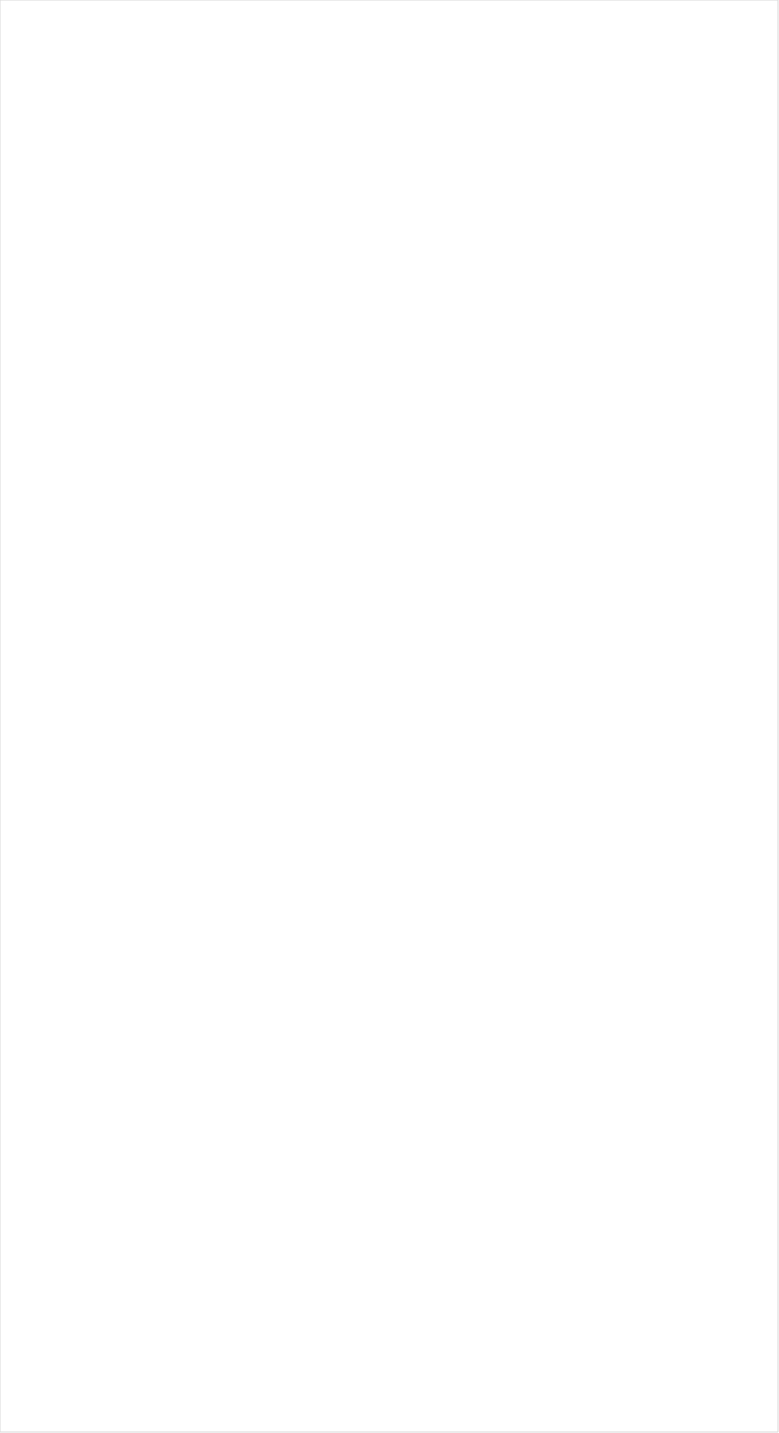
| Category | Total |
|---|---|
| Galavision | -0.905 |
| UniMas | -0.888 |
| Univision | -0.87 |
| NBC Universo | -0.861 |
| Telemundo | -0.85 |
| ESPN Deportes | -0.818 |
| TUDN | -0.803 |
| MTV2 | -0.724 |
| BET | -0.683 |
| Cartoon Network | -0.678 |
| TV ONE | -0.644 |
| Nick Toons | -0.643 |
| VH1 | -0.633 |
| Nick | -0.576 |
| Lifetime Movies | -0.522 |
| Disney Channel | -0.506 |
| Adult Swim | -0.503 |
| BET Her | -0.483 |
| Disney XD | -0.462 |
| Nick Jr. | -0.432 |
| Discovery Life Channel | -0.41 |
| Universal Kids | -0.367 |
| WE TV | -0.367 |
| Investigation Discovery | -0.366 |
| Logo | -0.365 |
| Disney Junior US | -0.359 |
| Oprah Winfrey Network | -0.348 |
| Travel | -0.333 |
| Lifetime | -0.324 |
| TLC | -0.32 |
| Nick@Nite | -0.318 |
| FXDEP | -0.298 |
| MTV | -0.251 |
| UP TV | -0.242 |
| OXYGEN | -0.217 |
| Discovery Family Channel | -0.207 |
| Freeform | -0.204 |
| E! | -0.179 |
| FXX | -0.163 |
| Hallmark Movies & Mysteries | -0.154 |
| truTV | -0.141 |
| Headline News | -0.139 |
| Hallmark | -0.123 |
| USA Network | -0.122 |
| A&E | -0.121 |
| INSP | -0.12 |
| ION | -0.118 |
| CMTV | -0.107 |
| FX | -0.106 |
| CW | -0.079 |
| Paramount Network | -0.075 |
| SYFY | -0.072 |
| BRAVO | -0.058 |
| Reelz Channel | -0.022 |
| POP | -0.016 |
| Great American Country | -0.009 |
| TNT | -0.007 |
| Viceland | -0.003 |
| FOX | 0.012 |
| Game Show | 0.015 |
| TBS | 0.031 |
| National Geographic Wild | 0.038 |
| FX Movie Channel | 0.054 |
| Animal Planet | 0.06 |
| Discovery Channel | 0.063 |
| AMC | 0.071 |
| TV LAND | 0.085 |
| Science Channel | 0.085 |
| NBA TV | 0.102 |
| Motor Trend Network | 0.127 |
| HGTV | 0.151 |
| MSNBC | 0.151 |
| History Channel | 0.154 |
| American Heroes Channel | 0.158 |
| Ovation | 0.159 |
| SundanceTV | 0.16 |
| Food Network | 0.166 |
| ABC | 0.17 |
| Comedy Central | 0.175 |
| CNN | 0.181 |
| Independent Film (IFC) | 0.183 |
| FYI | 0.199 |
| MyNetworkTV | 0.209 |
| National Geographic | 0.229 |
| WGN America | 0.229 |
| BBC America | 0.271 |
| RFD TV | 0.288 |
| Cooking Channel | 0.306 |
| NBC | 0.308 |
| Destination America | 0.357 |
| Weather Channel | 0.38 |
| CBS | 0.4 |
| Smithsonian | 0.42 |
| DIY | 0.425 |
| The Sportsman Channel | 0.426 |
| CNBC | 0.445 |
| Fox News | 0.491 |
| NFL Network | 0.534 |
| ESPNU | 0.543 |
| Outdoor Channel | 0.583 |
| PBS | 0.588 |
| Fox Business | 0.617 |
| ESPN | 0.662 |
| Bloomberg HD | 0.674 |
| ESPN2 | 0.989 |
| ESPNEWS | 1.004 |
| Olympic Channel | 1.052 |
| Tennis Channel | 1.121 |
| Fox Sports 1 | 1.154 |
| Big Ten Network | 1.201 |
| PAC-12 Network | 1.349 |
| MLB Network | 1.464 |
| CBS Sports | 1.516 |
| NHL | 1.525 |
| NBC Sports | 2.084 |
| Golf | 6.759 |